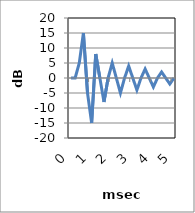
| Category | Series 0 |
|---|---|
| 0.0 | 0 |
| 0.2 | 0 |
| 0.4 | 5 |
| 0.6 | 15 |
| 0.8 | -5 |
| 1.0 | -15 |
| 1.2 | 8 |
| 1.4 | 0 |
| 1.6 | -8 |
| 1.8 | 0 |
| 2.0 | 5 |
| 2.2 | 0 |
| 2.4 | -5 |
| 2.6 | 0 |
| 2.8 | 4 |
| 3.0 | 0 |
| 3.2 | -4 |
| 3.4 | 0 |
| 3.6 | 3 |
| 3.8 | 0 |
| 4.0 | -3 |
| 4.2 | 0 |
| 4.4 | 2 |
| 4.6 | 0 |
| 4.8 | -2 |
| 5.0 | 0 |